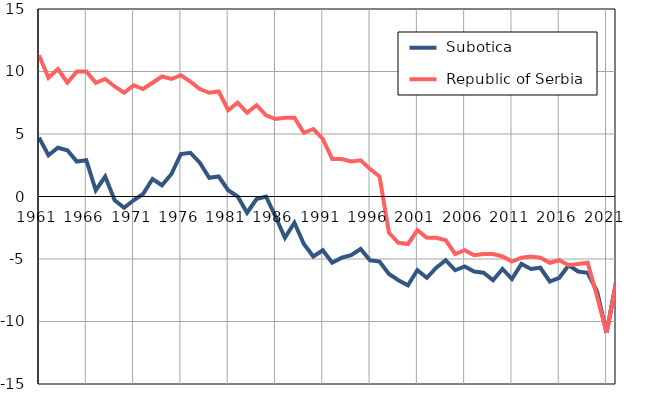
| Category |  Subotica |  Republic of Serbia |
|---|---|---|
| 1961.0 | 4.7 | 11.3 |
| 1962.0 | 3.3 | 9.5 |
| 1963.0 | 3.9 | 10.2 |
| 1964.0 | 3.7 | 9.1 |
| 1965.0 | 2.8 | 10 |
| 1966.0 | 2.9 | 10 |
| 1967.0 | 0.5 | 9.1 |
| 1968.0 | 1.6 | 9.4 |
| 1969.0 | -0.3 | 8.8 |
| 1970.0 | -0.9 | 8.3 |
| 1971.0 | -0.3 | 8.9 |
| 1972.0 | 0.2 | 8.6 |
| 1973.0 | 1.4 | 9.1 |
| 1974.0 | 0.9 | 9.6 |
| 1975.0 | 1.8 | 9.4 |
| 1976.0 | 3.4 | 9.7 |
| 1977.0 | 3.5 | 9.2 |
| 1978.0 | 2.7 | 8.6 |
| 1979.0 | 1.5 | 8.3 |
| 1980.0 | 1.6 | 8.4 |
| 1981.0 | 0.5 | 6.9 |
| 1982.0 | 0 | 7.5 |
| 1983.0 | -1.3 | 6.7 |
| 1984.0 | -0.2 | 7.3 |
| 1985.0 | 0 | 6.5 |
| 1986.0 | -1.6 | 6.2 |
| 1987.0 | -3.3 | 6.3 |
| 1988.0 | -2.1 | 6.3 |
| 1989.0 | -3.8 | 5.1 |
| 1990.0 | -4.8 | 5.4 |
| 1991.0 | -4.3 | 4.6 |
| 1992.0 | -5.3 | 3 |
| 1993.0 | -4.9 | 3 |
| 1994.0 | -4.7 | 2.8 |
| 1995.0 | -4.2 | 2.9 |
| 1996.0 | -5.1 | 2.2 |
| 1997.0 | -5.2 | 1.6 |
| 1998.0 | -6.2 | -2.9 |
| 1999.0 | -6.7 | -3.7 |
| 2000.0 | -7.1 | -3.8 |
| 2001.0 | -5.9 | -2.7 |
| 2002.0 | -6.5 | -3.3 |
| 2003.0 | -5.7 | -3.3 |
| 2004.0 | -5.1 | -3.5 |
| 2005.0 | -5.9 | -4.6 |
| 2006.0 | -5.6 | -4.3 |
| 2007.0 | -6 | -4.7 |
| 2008.0 | -6.1 | -4.6 |
| 2009.0 | -6.7 | -4.6 |
| 2010.0 | -5.8 | -4.8 |
| 2011.0 | -6.6 | -5.2 |
| 2012.0 | -5.4 | -4.9 |
| 2013.0 | -5.8 | -4.8 |
| 2014.0 | -5.7 | -4.9 |
| 2015.0 | -6.8 | -5.3 |
| 2016.0 | -6.5 | -5.1 |
| 2017.0 | -5.5 | -5.5 |
| 2018.0 | -6 | -5.4 |
| 2019.0 | -6.1 | -5.3 |
| 2020.0 | -7.6 | -8 |
| 2021.0 | -10.9 | -10.9 |
| 2022.0 | -6.9 | -7 |